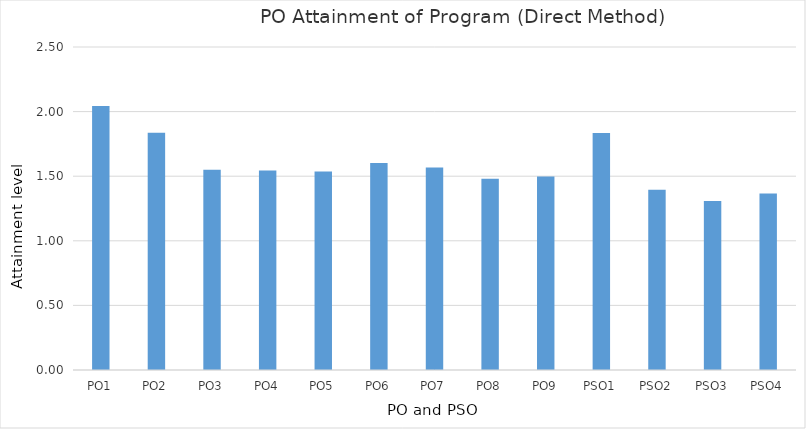
| Category | Series 0 |
|---|---|
| PO1 | 2.043 |
| PO2 | 1.837 |
| PO3 | 1.551 |
| PO4 | 1.543 |
| PO5 | 1.535 |
| PO6 | 1.602 |
| PO7 | 1.567 |
| PO8 | 1.481 |
| PO9 | 1.497 |
| PSO1 | 1.835 |
| PSO2 | 1.395 |
| PSO3 | 1.308 |
| PSO4 | 1.366 |